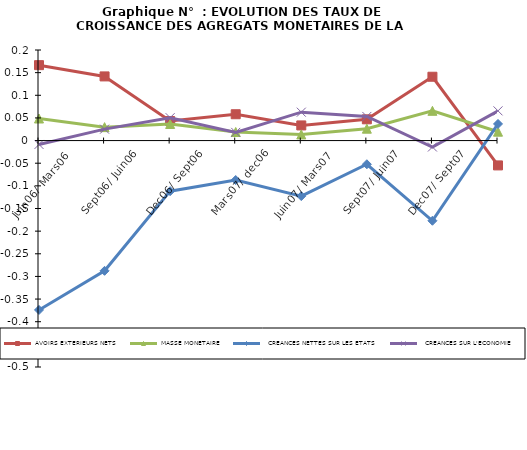
| Category | AVOIRS EXTERIEURS NETS | MASSE MONETAIRE |   CREANCES NETTES SUR LES ETATS |   CREANCES SUR L'ECONOMIE |
|---|---|---|---|---|
| Juin06/ Mars06 | 0.167 | 0.049 | -0.374 | -0.009 |
| Sept06/ Juin06 | 0.142 | 0.03 | -0.288 | 0.025 |
| Dec06/ Sept06 | 0.043 | 0.037 | -0.112 | 0.051 |
| Mars07/ dec06 | 0.058 | 0.019 | -0.087 | 0.018 |
| Juin07/ Mars07 | 0.033 | 0.014 | -0.123 | 0.063 |
| Sept07/ Juin07 | 0.047 | 0.026 | -0.052 | 0.053 |
| Dec07/ Sept07 | 0.141 | 0.066 | -0.177 | -0.014 |